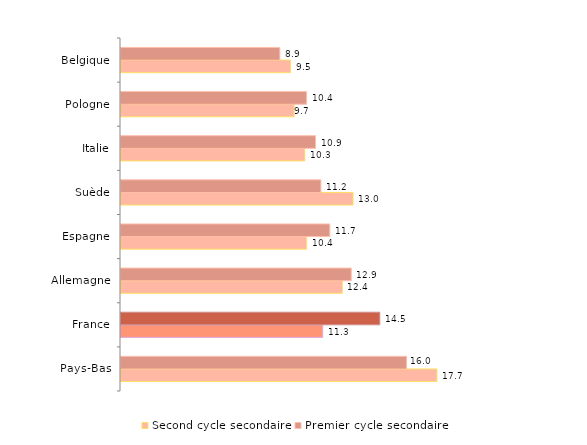
| Category | Second cycle secondaire | Premier cycle secondaire |
|---|---|---|
| Pays-Bas | 17.7 | 16 |
| France | 11.3 | 14.5 |
| Allemagne | 12.4 | 12.9 |
| Espagne | 10.4 | 11.7 |
| Suède | 13 | 11.2 |
| Italie | 10.3 | 10.9 |
| Pologne | 9.7 | 10.4 |
| Belgique | 9.5 | 8.9 |